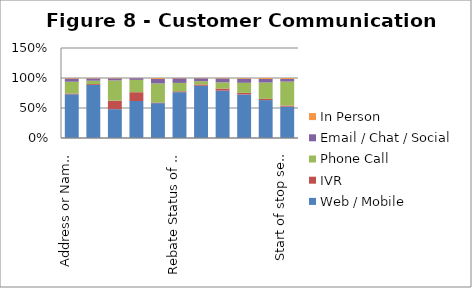
| Category | Web / Mobile | IVR | Phone Call | Email / Chat / Social | In Person |
|---|---|---|---|---|---|
| Address or Name Change | 0.729 | 0.013 | 0.196 | 0.053 | 0.008 |
| View electric/gas usage | 0.884 | 0.015 | 0.057 | 0.038 | 0.007 |
| Report a power outage | 0.481 | 0.142 | 0.337 | 0.034 | 0.006 |
| Power Outage Status | 0.617 | 0.147 | 0.206 | 0.028 | 0.003 |
| Construction Status about your construction/fuel conversion project (such as adding natural gas service) | 0.581 | 0.011 | 0.317 | 0.077 | 0.014 |
| Rebate Status of a rebate application | 0.764 | 0.015 | 0.14 | 0.076 | 0.005 |
| View Account Balance  | 0.871 | 0.022 | 0.053 | 0.049 | 0.005 |
| Confirm your payment has been made | 0.789 | 0.036 | 0.102 | 0.065 | 0.008 |
| Report a payment | 0.726 | 0.027 | 0.167 | 0.07 | 0.011 |
| Payment Arrangements | 0.632 | 0.02 | 0.273 | 0.06 | 0.016 |
| Start of stop service with PSE | 0.523 | 0.018 | 0.399 | 0.046 | 0.015 |